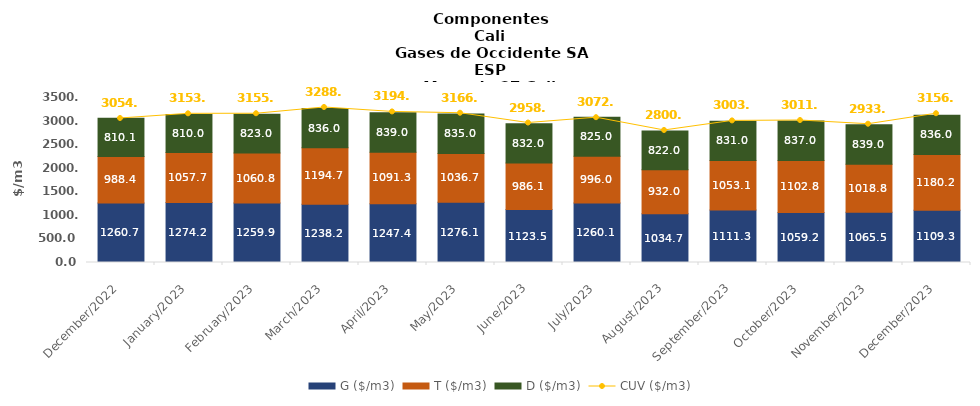
| Category | G ($/m3) | T ($/m3) | D ($/m3) |
|---|---|---|---|
| 2022-12-01 | 1260.7 | 988.43 | 810.07 |
| 2023-01-01 | 1274.19 | 1057.73 | 810 |
| 2023-02-01 | 1259.91 | 1060.8 | 823 |
| 2023-03-01 | 1238.18 | 1194.68 | 836 |
| 2023-04-01 | 1247.38 | 1091.29 | 839 |
| 2023-05-01 | 1276.06 | 1036.67 | 835 |
| 2023-06-01 | 1123.54 | 986.08 | 832 |
| 2023-07-01 | 1260.12 | 995.95 | 825 |
| 2023-08-01 | 1034.65 | 931.99 | 822 |
| 2023-09-01 | 1111.32 | 1053.08 | 831 |
| 2023-10-01 | 1059.24 | 1102.78 | 837 |
| 2023-11-01 | 1065.48 | 1018.81 | 839 |
| 2023-12-01 | 1109.29 | 1180.21 | 836 |